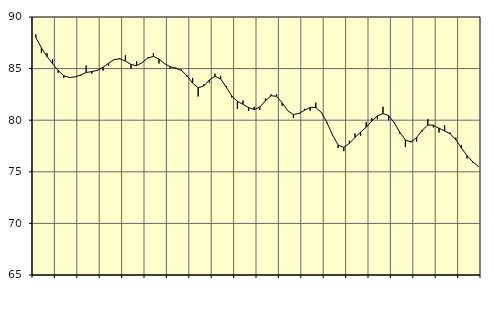
| Category | Piggar | Series 1 |
|---|---|---|
| nan | 88.3 | 88.03 |
| 1.0 | 86.5 | 87.01 |
| 1.0 | 86.5 | 86.17 |
| 1.0 | 85.9 | 85.47 |
| nan | 84.6 | 84.81 |
| 2.0 | 84.1 | 84.31 |
| 2.0 | 84.1 | 84.14 |
| 2.0 | 84.2 | 84.19 |
| nan | 84.3 | 84.38 |
| 3.0 | 85.3 | 84.62 |
| 3.0 | 84.5 | 84.71 |
| 3.0 | 84.8 | 84.83 |
| nan | 84.8 | 85.13 |
| 4.0 | 85.3 | 85.52 |
| 4.0 | 85.9 | 85.87 |
| 4.0 | 86 | 85.95 |
| nan | 86.3 | 85.73 |
| 5.0 | 85 | 85.4 |
| 5.0 | 85.7 | 85.28 |
| 5.0 | 85.6 | 85.58 |
| nan | 86.1 | 86.03 |
| 6.0 | 86.5 | 86.18 |
| 6.0 | 85.5 | 85.93 |
| 6.0 | 85.5 | 85.48 |
| nan | 85 | 85.18 |
| 7.0 | 85.1 | 85.03 |
| 7.0 | 84.9 | 84.82 |
| 7.0 | 84.2 | 84.32 |
| nan | 84.1 | 83.59 |
| 8.0 | 82.3 | 83.14 |
| 8.0 | 83.5 | 83.32 |
| 8.0 | 83.6 | 83.9 |
| nan | 84.5 | 84.25 |
| 9.0 | 84.3 | 84 |
| 9.0 | 83.3 | 83.21 |
| 9.0 | 82.2 | 82.34 |
| nan | 81.1 | 81.83 |
| 10.0 | 81.9 | 81.54 |
| 10.0 | 80.9 | 81.22 |
| 10.0 | 81.3 | 81.03 |
| nan | 81 | 81.27 |
| 11.0 | 82.1 | 81.88 |
| 11.0 | 82.5 | 82.37 |
| 11.0 | 82.5 | 82.32 |
| nan | 81.4 | 81.68 |
| 12.0 | 80.9 | 80.91 |
| 12.0 | 80.2 | 80.55 |
| 12.0 | 80.6 | 80.66 |
| nan | 81.1 | 80.97 |
| 13.0 | 80.9 | 81.24 |
| 13.0 | 81.7 | 81.23 |
| 13.0 | 80.8 | 80.75 |
| nan | 79.7 | 79.77 |
| 14.0 | 78.6 | 78.54 |
| 14.0 | 77.3 | 77.59 |
| 14.0 | 77 | 77.37 |
| nan | 78 | 77.76 |
| 15.0 | 78.7 | 78.32 |
| 15.0 | 78.5 | 78.84 |
| 15.0 | 79.8 | 79.32 |
| nan | 80.2 | 79.92 |
| 16.0 | 80.1 | 80.42 |
| 16.0 | 81.3 | 80.64 |
| 16.0 | 80 | 80.45 |
| nan | 79.8 | 79.76 |
| 17.0 | 78.7 | 78.83 |
| 17.0 | 77.4 | 78.09 |
| 17.0 | 78 | 77.88 |
| nan | 77.9 | 78.32 |
| 18.0 | 78.9 | 79.03 |
| 18.0 | 80.1 | 79.53 |
| 18.0 | 79.3 | 79.52 |
| nan | 78.8 | 79.22 |
| 19.0 | 79.5 | 78.96 |
| 19.0 | 78.8 | 78.68 |
| 19.0 | 78.3 | 78.11 |
| nan | 77.6 | 77.31 |
| 20.0 | 76.3 | 76.58 |
| 20.0 | 75.9 | 75.98 |
| 20.0 | 75.5 | 75.55 |